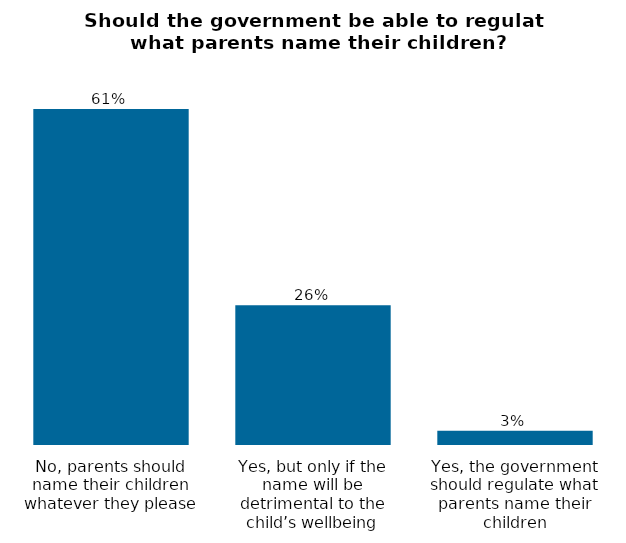
| Category | Series 0 |
|---|---|
| Yes, the government should regulate what parents name their children | 0.026 |
| Yes, but only if the name will be detrimental to the child’s wellbeing | 0.255 |
| No, parents should name their children whatever they please | 0.614 |